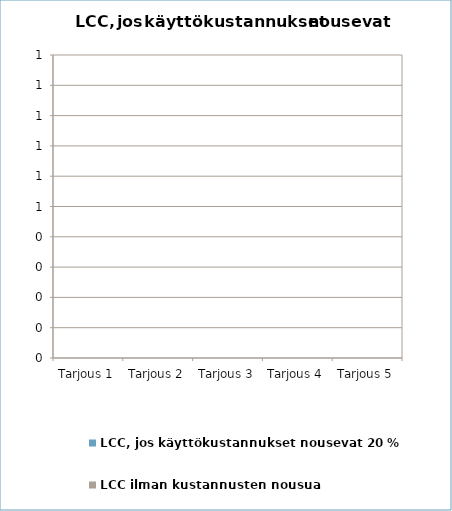
| Category | LCC, jos käyttökustannukset nousevat 20 % | LCC ilman kustannusten nousua |
|---|---|---|
| Tarjous 1 | 0 | 0 |
| Tarjous 2 | 0 | 0 |
| Tarjous 3 | 0 | 0 |
| Tarjous 4 | 0 | 0 |
| Tarjous 5 | 0 | 0 |